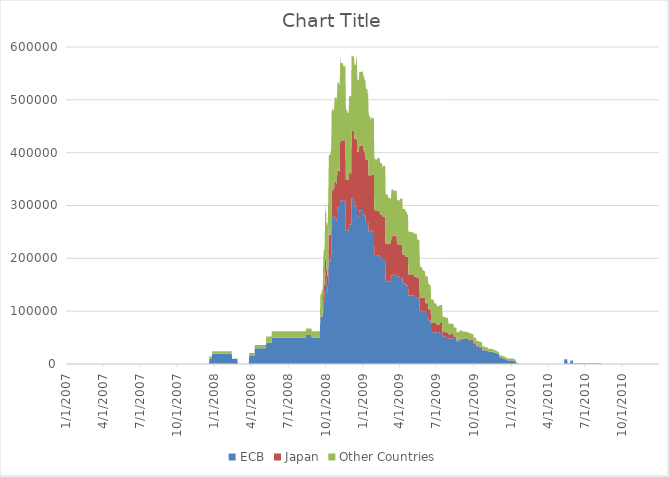
| Category | ECB | Japan | Other Countries |
|---|---|---|---|
| 1/1/07 | 0 | 0 | 0 |
| 1/2/07 | 0 | 0 | 0 |
| 1/3/07 | 0 | 0 | 0 |
| 1/4/07 | 0 | 0 | 0 |
| 1/5/07 | 0 | 0 | 0 |
| 1/6/07 | 0 | 0 | 0 |
| 1/7/07 | 0 | 0 | 0 |
| 1/8/07 | 0 | 0 | 0 |
| 1/9/07 | 0 | 0 | 0 |
| 1/10/07 | 0 | 0 | 0 |
| 1/11/07 | 0 | 0 | 0 |
| 1/12/07 | 0 | 0 | 0 |
| 1/13/07 | 0 | 0 | 0 |
| 1/14/07 | 0 | 0 | 0 |
| 1/15/07 | 0 | 0 | 0 |
| 1/16/07 | 0 | 0 | 0 |
| 1/17/07 | 0 | 0 | 0 |
| 1/18/07 | 0 | 0 | 0 |
| 1/19/07 | 0 | 0 | 0 |
| 1/20/07 | 0 | 0 | 0 |
| 1/21/07 | 0 | 0 | 0 |
| 1/22/07 | 0 | 0 | 0 |
| 1/23/07 | 0 | 0 | 0 |
| 1/24/07 | 0 | 0 | 0 |
| 1/25/07 | 0 | 0 | 0 |
| 1/26/07 | 0 | 0 | 0 |
| 1/27/07 | 0 | 0 | 0 |
| 1/28/07 | 0 | 0 | 0 |
| 1/29/07 | 0 | 0 | 0 |
| 1/30/07 | 0 | 0 | 0 |
| 1/31/07 | 0 | 0 | 0 |
| 2/1/07 | 0 | 0 | 0 |
| 2/2/07 | 0 | 0 | 0 |
| 2/3/07 | 0 | 0 | 0 |
| 2/4/07 | 0 | 0 | 0 |
| 2/5/07 | 0 | 0 | 0 |
| 2/6/07 | 0 | 0 | 0 |
| 2/7/07 | 0 | 0 | 0 |
| 2/8/07 | 0 | 0 | 0 |
| 2/9/07 | 0 | 0 | 0 |
| 2/10/07 | 0 | 0 | 0 |
| 2/11/07 | 0 | 0 | 0 |
| 2/12/07 | 0 | 0 | 0 |
| 2/13/07 | 0 | 0 | 0 |
| 2/14/07 | 0 | 0 | 0 |
| 2/15/07 | 0 | 0 | 0 |
| 2/16/07 | 0 | 0 | 0 |
| 2/17/07 | 0 | 0 | 0 |
| 2/18/07 | 0 | 0 | 0 |
| 2/19/07 | 0 | 0 | 0 |
| 2/20/07 | 0 | 0 | 0 |
| 2/21/07 | 0 | 0 | 0 |
| 2/22/07 | 0 | 0 | 0 |
| 2/23/07 | 0 | 0 | 0 |
| 2/24/07 | 0 | 0 | 0 |
| 2/25/07 | 0 | 0 | 0 |
| 2/26/07 | 0 | 0 | 0 |
| 2/27/07 | 0 | 0 | 0 |
| 2/28/07 | 0 | 0 | 0 |
| 3/1/07 | 0 | 0 | 0 |
| 3/2/07 | 0 | 0 | 0 |
| 3/3/07 | 0 | 0 | 0 |
| 3/4/07 | 0 | 0 | 0 |
| 3/5/07 | 0 | 0 | 0 |
| 3/6/07 | 0 | 0 | 0 |
| 3/7/07 | 0 | 0 | 0 |
| 3/8/07 | 0 | 0 | 0 |
| 3/9/07 | 0 | 0 | 0 |
| 3/10/07 | 0 | 0 | 0 |
| 3/11/07 | 0 | 0 | 0 |
| 3/12/07 | 0 | 0 | 0 |
| 3/13/07 | 0 | 0 | 0 |
| 3/14/07 | 0 | 0 | 0 |
| 3/15/07 | 0 | 0 | 0 |
| 3/16/07 | 0 | 0 | 0 |
| 3/17/07 | 0 | 0 | 0 |
| 3/18/07 | 0 | 0 | 0 |
| 3/19/07 | 0 | 0 | 0 |
| 3/20/07 | 0 | 0 | 0 |
| 3/21/07 | 0 | 0 | 0 |
| 3/22/07 | 0 | 0 | 0 |
| 3/23/07 | 0 | 0 | 0 |
| 3/24/07 | 0 | 0 | 0 |
| 3/25/07 | 0 | 0 | 0 |
| 3/26/07 | 0 | 0 | 0 |
| 3/27/07 | 0 | 0 | 0 |
| 3/28/07 | 0 | 0 | 0 |
| 3/29/07 | 0 | 0 | 0 |
| 3/30/07 | 0 | 0 | 0 |
| 3/31/07 | 0 | 0 | 0 |
| 4/1/07 | 0 | 0 | 0 |
| 4/2/07 | 0 | 0 | 0 |
| 4/3/07 | 0 | 0 | 0 |
| 4/4/07 | 0 | 0 | 0 |
| 4/5/07 | 0 | 0 | 0 |
| 4/6/07 | 0 | 0 | 0 |
| 4/7/07 | 0 | 0 | 0 |
| 4/8/07 | 0 | 0 | 0 |
| 4/9/07 | 0 | 0 | 0 |
| 4/10/07 | 0 | 0 | 0 |
| 4/11/07 | 0 | 0 | 0 |
| 4/12/07 | 0 | 0 | 0 |
| 4/13/07 | 0 | 0 | 0 |
| 4/14/07 | 0 | 0 | 0 |
| 4/15/07 | 0 | 0 | 0 |
| 4/16/07 | 0 | 0 | 0 |
| 4/17/07 | 0 | 0 | 0 |
| 4/18/07 | 0 | 0 | 0 |
| 4/19/07 | 0 | 0 | 0 |
| 4/20/07 | 0 | 0 | 0 |
| 4/21/07 | 0 | 0 | 0 |
| 4/22/07 | 0 | 0 | 0 |
| 4/23/07 | 0 | 0 | 0 |
| 4/24/07 | 0 | 0 | 0 |
| 4/25/07 | 0 | 0 | 0 |
| 4/26/07 | 0 | 0 | 0 |
| 4/27/07 | 0 | 0 | 0 |
| 4/28/07 | 0 | 0 | 0 |
| 4/29/07 | 0 | 0 | 0 |
| 4/30/07 | 0 | 0 | 0 |
| 5/1/07 | 0 | 0 | 0 |
| 5/2/07 | 0 | 0 | 0 |
| 5/3/07 | 0 | 0 | 0 |
| 5/4/07 | 0 | 0 | 0 |
| 5/5/07 | 0 | 0 | 0 |
| 5/6/07 | 0 | 0 | 0 |
| 5/7/07 | 0 | 0 | 0 |
| 5/8/07 | 0 | 0 | 0 |
| 5/9/07 | 0 | 0 | 0 |
| 5/10/07 | 0 | 0 | 0 |
| 5/11/07 | 0 | 0 | 0 |
| 5/12/07 | 0 | 0 | 0 |
| 5/13/07 | 0 | 0 | 0 |
| 5/14/07 | 0 | 0 | 0 |
| 5/15/07 | 0 | 0 | 0 |
| 5/16/07 | 0 | 0 | 0 |
| 5/17/07 | 0 | 0 | 0 |
| 5/18/07 | 0 | 0 | 0 |
| 5/19/07 | 0 | 0 | 0 |
| 5/20/07 | 0 | 0 | 0 |
| 5/21/07 | 0 | 0 | 0 |
| 5/22/07 | 0 | 0 | 0 |
| 5/23/07 | 0 | 0 | 0 |
| 5/24/07 | 0 | 0 | 0 |
| 5/25/07 | 0 | 0 | 0 |
| 5/26/07 | 0 | 0 | 0 |
| 5/27/07 | 0 | 0 | 0 |
| 5/28/07 | 0 | 0 | 0 |
| 5/29/07 | 0 | 0 | 0 |
| 5/30/07 | 0 | 0 | 0 |
| 5/31/07 | 0 | 0 | 0 |
| 6/1/07 | 0 | 0 | 0 |
| 6/2/07 | 0 | 0 | 0 |
| 6/3/07 | 0 | 0 | 0 |
| 6/4/07 | 0 | 0 | 0 |
| 6/5/07 | 0 | 0 | 0 |
| 6/6/07 | 0 | 0 | 0 |
| 6/7/07 | 0 | 0 | 0 |
| 6/8/07 | 0 | 0 | 0 |
| 6/9/07 | 0 | 0 | 0 |
| 6/10/07 | 0 | 0 | 0 |
| 6/11/07 | 0 | 0 | 0 |
| 6/12/07 | 0 | 0 | 0 |
| 6/13/07 | 0 | 0 | 0 |
| 6/14/07 | 0 | 0 | 0 |
| 6/15/07 | 0 | 0 | 0 |
| 6/16/07 | 0 | 0 | 0 |
| 6/17/07 | 0 | 0 | 0 |
| 6/18/07 | 0 | 0 | 0 |
| 6/19/07 | 0 | 0 | 0 |
| 6/20/07 | 0 | 0 | 0 |
| 6/21/07 | 0 | 0 | 0 |
| 6/22/07 | 0 | 0 | 0 |
| 6/23/07 | 0 | 0 | 0 |
| 6/24/07 | 0 | 0 | 0 |
| 6/25/07 | 0 | 0 | 0 |
| 6/26/07 | 0 | 0 | 0 |
| 6/27/07 | 0 | 0 | 0 |
| 6/28/07 | 0 | 0 | 0 |
| 6/29/07 | 0 | 0 | 0 |
| 6/30/07 | 0 | 0 | 0 |
| 7/1/07 | 0 | 0 | 0 |
| 7/2/07 | 0 | 0 | 0 |
| 7/3/07 | 0 | 0 | 0 |
| 7/4/07 | 0 | 0 | 0 |
| 7/5/07 | 0 | 0 | 0 |
| 7/6/07 | 0 | 0 | 0 |
| 7/7/07 | 0 | 0 | 0 |
| 7/8/07 | 0 | 0 | 0 |
| 7/9/07 | 0 | 0 | 0 |
| 7/10/07 | 0 | 0 | 0 |
| 7/11/07 | 0 | 0 | 0 |
| 7/12/07 | 0 | 0 | 0 |
| 7/13/07 | 0 | 0 | 0 |
| 7/14/07 | 0 | 0 | 0 |
| 7/15/07 | 0 | 0 | 0 |
| 7/16/07 | 0 | 0 | 0 |
| 7/17/07 | 0 | 0 | 0 |
| 7/18/07 | 0 | 0 | 0 |
| 7/19/07 | 0 | 0 | 0 |
| 7/20/07 | 0 | 0 | 0 |
| 7/21/07 | 0 | 0 | 0 |
| 7/22/07 | 0 | 0 | 0 |
| 7/23/07 | 0 | 0 | 0 |
| 7/24/07 | 0 | 0 | 0 |
| 7/25/07 | 0 | 0 | 0 |
| 7/26/07 | 0 | 0 | 0 |
| 7/27/07 | 0 | 0 | 0 |
| 7/28/07 | 0 | 0 | 0 |
| 7/29/07 | 0 | 0 | 0 |
| 7/30/07 | 0 | 0 | 0 |
| 7/31/07 | 0 | 0 | 0 |
| 8/1/07 | 0 | 0 | 0 |
| 8/2/07 | 0 | 0 | 0 |
| 8/3/07 | 0 | 0 | 0 |
| 8/4/07 | 0 | 0 | 0 |
| 8/5/07 | 0 | 0 | 0 |
| 8/6/07 | 0 | 0 | 0 |
| 8/7/07 | 0 | 0 | 0 |
| 8/8/07 | 0 | 0 | 0 |
| 8/9/07 | 0 | 0 | 0 |
| 8/10/07 | 0 | 0 | 0 |
| 8/11/07 | 0 | 0 | 0 |
| 8/12/07 | 0 | 0 | 0 |
| 8/13/07 | 0 | 0 | 0 |
| 8/14/07 | 0 | 0 | 0 |
| 8/15/07 | 0 | 0 | 0 |
| 8/16/07 | 0 | 0 | 0 |
| 8/17/07 | 0 | 0 | 0 |
| 8/18/07 | 0 | 0 | 0 |
| 8/19/07 | 0 | 0 | 0 |
| 8/20/07 | 0 | 0 | 0 |
| 8/21/07 | 0 | 0 | 0 |
| 8/22/07 | 0 | 0 | 0 |
| 8/23/07 | 0 | 0 | 0 |
| 8/24/07 | 0 | 0 | 0 |
| 8/25/07 | 0 | 0 | 0 |
| 8/26/07 | 0 | 0 | 0 |
| 8/27/07 | 0 | 0 | 0 |
| 8/28/07 | 0 | 0 | 0 |
| 8/29/07 | 0 | 0 | 0 |
| 8/30/07 | 0 | 0 | 0 |
| 8/31/07 | 0 | 0 | 0 |
| 9/1/07 | 0 | 0 | 0 |
| 9/2/07 | 0 | 0 | 0 |
| 9/3/07 | 0 | 0 | 0 |
| 9/4/07 | 0 | 0 | 0 |
| 9/5/07 | 0 | 0 | 0 |
| 9/6/07 | 0 | 0 | 0 |
| 9/7/07 | 0 | 0 | 0 |
| 9/8/07 | 0 | 0 | 0 |
| 9/9/07 | 0 | 0 | 0 |
| 9/10/07 | 0 | 0 | 0 |
| 9/11/07 | 0 | 0 | 0 |
| 9/12/07 | 0 | 0 | 0 |
| 9/13/07 | 0 | 0 | 0 |
| 9/14/07 | 0 | 0 | 0 |
| 9/15/07 | 0 | 0 | 0 |
| 9/16/07 | 0 | 0 | 0 |
| 9/17/07 | 0 | 0 | 0 |
| 9/18/07 | 0 | 0 | 0 |
| 9/19/07 | 0 | 0 | 0 |
| 9/20/07 | 0 | 0 | 0 |
| 9/21/07 | 0 | 0 | 0 |
| 9/22/07 | 0 | 0 | 0 |
| 9/23/07 | 0 | 0 | 0 |
| 9/24/07 | 0 | 0 | 0 |
| 9/25/07 | 0 | 0 | 0 |
| 9/26/07 | 0 | 0 | 0 |
| 9/27/07 | 0 | 0 | 0 |
| 9/28/07 | 0 | 0 | 0 |
| 9/29/07 | 0 | 0 | 0 |
| 9/30/07 | 0 | 0 | 0 |
| 10/1/07 | 0 | 0 | 0 |
| 10/2/07 | 0 | 0 | 0 |
| 10/3/07 | 0 | 0 | 0 |
| 10/4/07 | 0 | 0 | 0 |
| 10/5/07 | 0 | 0 | 0 |
| 10/6/07 | 0 | 0 | 0 |
| 10/7/07 | 0 | 0 | 0 |
| 10/8/07 | 0 | 0 | 0 |
| 10/9/07 | 0 | 0 | 0 |
| 10/10/07 | 0 | 0 | 0 |
| 10/11/07 | 0 | 0 | 0 |
| 10/12/07 | 0 | 0 | 0 |
| 10/13/07 | 0 | 0 | 0 |
| 10/14/07 | 0 | 0 | 0 |
| 10/15/07 | 0 | 0 | 0 |
| 10/16/07 | 0 | 0 | 0 |
| 10/17/07 | 0 | 0 | 0 |
| 10/18/07 | 0 | 0 | 0 |
| 10/19/07 | 0 | 0 | 0 |
| 10/20/07 | 0 | 0 | 0 |
| 10/21/07 | 0 | 0 | 0 |
| 10/22/07 | 0 | 0 | 0 |
| 10/23/07 | 0 | 0 | 0 |
| 10/24/07 | 0 | 0 | 0 |
| 10/25/07 | 0 | 0 | 0 |
| 10/26/07 | 0 | 0 | 0 |
| 10/27/07 | 0 | 0 | 0 |
| 10/28/07 | 0 | 0 | 0 |
| 10/29/07 | 0 | 0 | 0 |
| 10/30/07 | 0 | 0 | 0 |
| 10/31/07 | 0 | 0 | 0 |
| 11/1/07 | 0 | 0 | 0 |
| 11/2/07 | 0 | 0 | 0 |
| 11/3/07 | 0 | 0 | 0 |
| 11/4/07 | 0 | 0 | 0 |
| 11/5/07 | 0 | 0 | 0 |
| 11/6/07 | 0 | 0 | 0 |
| 11/7/07 | 0 | 0 | 0 |
| 11/8/07 | 0 | 0 | 0 |
| 11/9/07 | 0 | 0 | 0 |
| 11/10/07 | 0 | 0 | 0 |
| 11/11/07 | 0 | 0 | 0 |
| 11/12/07 | 0 | 0 | 0 |
| 11/13/07 | 0 | 0 | 0 |
| 11/14/07 | 0 | 0 | 0 |
| 11/15/07 | 0 | 0 | 0 |
| 11/16/07 | 0 | 0 | 0 |
| 11/17/07 | 0 | 0 | 0 |
| 11/18/07 | 0 | 0 | 0 |
| 11/19/07 | 0 | 0 | 0 |
| 11/20/07 | 0 | 0 | 0 |
| 11/21/07 | 0 | 0 | 0 |
| 11/22/07 | 0 | 0 | 0 |
| 11/23/07 | 0 | 0 | 0 |
| 11/24/07 | 0 | 0 | 0 |
| 11/25/07 | 0 | 0 | 0 |
| 11/26/07 | 0 | 0 | 0 |
| 11/27/07 | 0 | 0 | 0 |
| 11/28/07 | 0 | 0 | 0 |
| 11/29/07 | 0 | 0 | 0 |
| 11/30/07 | 0 | 0 | 0 |
| 12/1/07 | 0 | 0 | 0 |
| 12/2/07 | 0 | 0 | 0 |
| 12/3/07 | 0 | 0 | 0 |
| 12/4/07 | 0 | 0 | 0 |
| 12/5/07 | 0 | 0 | 0 |
| 12/6/07 | 0 | 0 | 0 |
| 12/7/07 | 0 | 0 | 0 |
| 12/8/07 | 0 | 0 | 0 |
| 12/9/07 | 0 | 0 | 0 |
| 12/10/07 | 0 | 0 | 0 |
| 12/11/07 | 0 | 0 | 0 |
| 12/12/07 | 0 | 0 | 0 |
| 12/13/07 | 0 | 0 | 0 |
| 12/14/07 | 0 | 0 | 0 |
| 12/15/07 | 0 | 0 | 0 |
| 12/16/07 | 0 | 0 | 0 |
| 12/17/07 | 0 | 0 | 0 |
| 12/18/07 | 0 | 0 | 0 |
| 12/19/07 | 0 | 0 | 0 |
| 12/20/07 | 10000 | 0 | 4000 |
| 12/21/07 | 10000 | 0 | 4000 |
| 12/22/07 | 10000 | 0 | 4000 |
| 12/23/07 | 10000 | 0 | 4000 |
| 12/24/07 | 10000 | 0 | 4000 |
| 12/25/07 | 10000 | 0 | 4000 |
| 12/26/07 | 10000 | 0 | 4000 |
| 12/27/07 | 20000 | 0 | 4000 |
| 12/28/07 | 20000 | 0 | 4000 |
| 12/29/07 | 20000 | 0 | 4000 |
| 12/30/07 | 20000 | 0 | 4000 |
| 12/31/07 | 20000 | 0 | 4000 |
| 1/1/08 | 20000 | 0 | 4000 |
| 1/2/08 | 20000 | 0 | 4000 |
| 1/3/08 | 20000 | 0 | 4000 |
| 1/4/08 | 20000 | 0 | 4000 |
| 1/5/08 | 20000 | 0 | 4000 |
| 1/6/08 | 20000 | 0 | 4000 |
| 1/7/08 | 20000 | 0 | 4000 |
| 1/8/08 | 20000 | 0 | 4000 |
| 1/9/08 | 20000 | 0 | 4000 |
| 1/10/08 | 20000 | 0 | 4000 |
| 1/11/08 | 20000 | 0 | 4000 |
| 1/12/08 | 20000 | 0 | 4000 |
| 1/13/08 | 20000 | 0 | 4000 |
| 1/14/08 | 20000 | 0 | 4000 |
| 1/15/08 | 20000 | 0 | 4000 |
| 1/16/08 | 20000 | 0 | 4000 |
| 1/17/08 | 20000 | 0 | 4000 |
| 1/18/08 | 20000 | 0 | 4000 |
| 1/19/08 | 20000 | 0 | 4000 |
| 1/20/08 | 20000 | 0 | 4000 |
| 1/21/08 | 20000 | 0 | 4000 |
| 1/22/08 | 20000 | 0 | 4000 |
| 1/23/08 | 20000 | 0 | 4000 |
| 1/24/08 | 20000 | 0 | 4000 |
| 1/25/08 | 20000 | 0 | 4000 |
| 1/26/08 | 20000 | 0 | 4000 |
| 1/27/08 | 20000 | 0 | 4000 |
| 1/28/08 | 20000 | 0 | 4000 |
| 1/29/08 | 20000 | 0 | 4000 |
| 1/30/08 | 20000 | 0 | 4000 |
| 1/31/08 | 20000 | 0 | 4000 |
| 2/1/08 | 20000 | 0 | 4000 |
| 2/2/08 | 20000 | 0 | 4000 |
| 2/3/08 | 20000 | 0 | 4000 |
| 2/4/08 | 20000 | 0 | 4000 |
| 2/5/08 | 20000 | 0 | 4000 |
| 2/6/08 | 20000 | 0 | 4000 |
| 2/7/08 | 20000 | 0 | 4000 |
| 2/8/08 | 20000 | 0 | 4000 |
| 2/9/08 | 20000 | 0 | 4000 |
| 2/10/08 | 20000 | 0 | 4000 |
| 2/11/08 | 20000 | 0 | 4000 |
| 2/12/08 | 20000 | 0 | 4000 |
| 2/13/08 | 20000 | 0 | 4000 |
| 2/14/08 | 10000 | 0 | 0 |
| 2/15/08 | 10000 | 0 | 0 |
| 2/16/08 | 10000 | 0 | 0 |
| 2/17/08 | 10000 | 0 | 0 |
| 2/18/08 | 10000 | 0 | 0 |
| 2/19/08 | 10000 | 0 | 0 |
| 2/20/08 | 10000 | 0 | 0 |
| 2/21/08 | 10000 | 0 | 0 |
| 2/22/08 | 10000 | 0 | 0 |
| 2/23/08 | 10000 | 0 | 0 |
| 2/24/08 | 10000 | 0 | 0 |
| 2/25/08 | 10000 | 0 | 0 |
| 2/26/08 | 10000 | 0 | 0 |
| 2/27/08 | 10000 | 0 | 0 |
| 2/28/08 | 0 | 0 | 0 |
| 2/29/08 | 0 | 0 | 0 |
| 3/1/08 | 0 | 0 | 0 |
| 3/2/08 | 0 | 0 | 0 |
| 3/3/08 | 0 | 0 | 0 |
| 3/4/08 | 0 | 0 | 0 |
| 3/5/08 | 0 | 0 | 0 |
| 3/6/08 | 0 | 0 | 0 |
| 3/7/08 | 0 | 0 | 0 |
| 3/8/08 | 0 | 0 | 0 |
| 3/9/08 | 0 | 0 | 0 |
| 3/10/08 | 0 | 0 | 0 |
| 3/11/08 | 0 | 0 | 0 |
| 3/12/08 | 0 | 0 | 0 |
| 3/13/08 | 0 | 0 | 0 |
| 3/14/08 | 0 | 0 | 0 |
| 3/15/08 | 0 | 0 | 0 |
| 3/16/08 | 0 | 0 | 0 |
| 3/17/08 | 0 | 0 | 0 |
| 3/18/08 | 0 | 0 | 0 |
| 3/19/08 | 0 | 0 | 0 |
| 3/20/08 | 0 | 0 | 0 |
| 3/21/08 | 0 | 0 | 0 |
| 3/22/08 | 0 | 0 | 0 |
| 3/23/08 | 0 | 0 | 0 |
| 3/24/08 | 0 | 0 | 0 |
| 3/25/08 | 0 | 0 | 0 |
| 3/26/08 | 0 | 0 | 0 |
| 3/27/08 | 15000 | 0 | 6000 |
| 3/28/08 | 15000 | 0 | 6000 |
| 3/29/08 | 15000 | 0 | 6000 |
| 3/30/08 | 15000 | 0 | 6000 |
| 3/31/08 | 15000 | 0 | 6000 |
| 4/1/08 | 15000 | 0 | 6000 |
| 4/2/08 | 15000 | 0 | 6000 |
| 4/3/08 | 15000 | 0 | 6000 |
| 4/4/08 | 15000 | 0 | 6000 |
| 4/5/08 | 15000 | 0 | 6000 |
| 4/6/08 | 15000 | 0 | 6000 |
| 4/7/08 | 15000 | 0 | 6000 |
| 4/8/08 | 15000 | 0 | 6000 |
| 4/9/08 | 15000 | 0 | 6000 |
| 4/10/08 | 30000 | 0 | 6000 |
| 4/11/08 | 30000 | 0 | 6000 |
| 4/12/08 | 30000 | 0 | 6000 |
| 4/13/08 | 30000 | 0 | 6000 |
| 4/14/08 | 30000 | 0 | 6000 |
| 4/15/08 | 30000 | 0 | 6000 |
| 4/16/08 | 30000 | 0 | 6000 |
| 4/17/08 | 30000 | 0 | 6000 |
| 4/18/08 | 30000 | 0 | 6000 |
| 4/19/08 | 30000 | 0 | 6000 |
| 4/20/08 | 30000 | 0 | 6000 |
| 4/21/08 | 30000 | 0 | 6000 |
| 4/22/08 | 30000 | 0 | 6000 |
| 4/23/08 | 30000 | 0 | 6000 |
| 4/24/08 | 30000 | 0 | 6000 |
| 4/25/08 | 30000 | 0 | 6000 |
| 4/26/08 | 30000 | 0 | 6000 |
| 4/27/08 | 30000 | 0 | 6000 |
| 4/28/08 | 30000 | 0 | 6000 |
| 4/29/08 | 30000 | 0 | 6000 |
| 4/30/08 | 30000 | 0 | 6000 |
| 5/1/08 | 30000 | 0 | 6000 |
| 5/2/08 | 30000 | 0 | 6000 |
| 5/3/08 | 30000 | 0 | 6000 |
| 5/4/08 | 30000 | 0 | 6000 |
| 5/5/08 | 30000 | 0 | 6000 |
| 5/6/08 | 30000 | 0 | 6000 |
| 5/7/08 | 30000 | 0 | 6000 |
| 5/8/08 | 40000 | 0 | 12000 |
| 5/9/08 | 40000 | 0 | 12000 |
| 5/10/08 | 40000 | 0 | 12000 |
| 5/11/08 | 40000 | 0 | 12000 |
| 5/12/08 | 40000 | 0 | 12000 |
| 5/13/08 | 40000 | 0 | 12000 |
| 5/14/08 | 40000 | 0 | 12000 |
| 5/15/08 | 40000 | 0 | 12000 |
| 5/16/08 | 40000 | 0 | 12000 |
| 5/17/08 | 40000 | 0 | 12000 |
| 5/18/08 | 40000 | 0 | 12000 |
| 5/19/08 | 40000 | 0 | 12000 |
| 5/20/08 | 40000 | 0 | 12000 |
| 5/21/08 | 40000 | 0 | 12000 |
| 5/22/08 | 50000 | 0 | 12000 |
| 5/23/08 | 50000 | 0 | 12000 |
| 5/24/08 | 50000 | 0 | 12000 |
| 5/25/08 | 50000 | 0 | 12000 |
| 5/26/08 | 50000 | 0 | 12000 |
| 5/27/08 | 50000 | 0 | 12000 |
| 5/28/08 | 50000 | 0 | 12000 |
| 5/29/08 | 50000 | 0 | 12000 |
| 5/30/08 | 50000 | 0 | 12000 |
| 5/31/08 | 50000 | 0 | 12000 |
| 6/1/08 | 50000 | 0 | 12000 |
| 6/2/08 | 50000 | 0 | 12000 |
| 6/3/08 | 50000 | 0 | 12000 |
| 6/4/08 | 50000 | 0 | 12000 |
| 6/5/08 | 50000 | 0 | 12000 |
| 6/6/08 | 50000 | 0 | 12000 |
| 6/7/08 | 50000 | 0 | 12000 |
| 6/8/08 | 50000 | 0 | 12000 |
| 6/9/08 | 50000 | 0 | 12000 |
| 6/10/08 | 50000 | 0 | 12000 |
| 6/11/08 | 50000 | 0 | 12000 |
| 6/12/08 | 50000 | 0 | 12000 |
| 6/13/08 | 50000 | 0 | 12000 |
| 6/14/08 | 50000 | 0 | 12000 |
| 6/15/08 | 50000 | 0 | 12000 |
| 6/16/08 | 50000 | 0 | 12000 |
| 6/17/08 | 50000 | 0 | 12000 |
| 6/18/08 | 50000 | 0 | 12000 |
| 6/19/08 | 50000 | 0 | 12000 |
| 6/20/08 | 50000 | 0 | 12000 |
| 6/21/08 | 50000 | 0 | 12000 |
| 6/22/08 | 50000 | 0 | 12000 |
| 6/23/08 | 50000 | 0 | 12000 |
| 6/24/08 | 50000 | 0 | 12000 |
| 6/25/08 | 50000 | 0 | 12000 |
| 6/26/08 | 50000 | 0 | 12000 |
| 6/27/08 | 50000 | 0 | 12000 |
| 6/28/08 | 50000 | 0 | 12000 |
| 6/29/08 | 50000 | 0 | 12000 |
| 6/30/08 | 50000 | 0 | 12000 |
| 7/1/08 | 50000 | 0 | 12000 |
| 7/2/08 | 50000 | 0 | 12000 |
| 7/3/08 | 50000 | 0 | 12000 |
| 7/4/08 | 50000 | 0 | 12000 |
| 7/5/08 | 50000 | 0 | 12000 |
| 7/6/08 | 50000 | 0 | 12000 |
| 7/7/08 | 50000 | 0 | 12000 |
| 7/8/08 | 50000 | 0 | 12000 |
| 7/9/08 | 50000 | 0 | 12000 |
| 7/10/08 | 50000 | 0 | 12000 |
| 7/11/08 | 50000 | 0 | 12000 |
| 7/12/08 | 50000 | 0 | 12000 |
| 7/13/08 | 50000 | 0 | 12000 |
| 7/14/08 | 50000 | 0 | 12000 |
| 7/15/08 | 50000 | 0 | 12000 |
| 7/16/08 | 50000 | 0 | 12000 |
| 7/17/08 | 50000 | 0 | 12000 |
| 7/18/08 | 50000 | 0 | 12000 |
| 7/19/08 | 50000 | 0 | 12000 |
| 7/20/08 | 50000 | 0 | 12000 |
| 7/21/08 | 50000 | 0 | 12000 |
| 7/22/08 | 50000 | 0 | 12000 |
| 7/23/08 | 50000 | 0 | 12000 |
| 7/24/08 | 50000 | 0 | 12000 |
| 7/25/08 | 50000 | 0 | 12000 |
| 7/26/08 | 50000 | 0 | 12000 |
| 7/27/08 | 50000 | 0 | 12000 |
| 7/28/08 | 50000 | 0 | 12000 |
| 7/29/08 | 50000 | 0 | 12000 |
| 7/30/08 | 50000 | 0 | 12000 |
| 7/31/08 | 50000 | 0 | 12000 |
| 8/1/08 | 50000 | 0 | 12000 |
| 8/2/08 | 50000 | 0 | 12000 |
| 8/3/08 | 50000 | 0 | 12000 |
| 8/4/08 | 50000 | 0 | 12000 |
| 8/5/08 | 50000 | 0 | 12000 |
| 8/6/08 | 50000 | 0 | 12000 |
| 8/7/08 | 50000 | 0 | 12000 |
| 8/8/08 | 50000 | 0 | 12000 |
| 8/9/08 | 50000 | 0 | 12000 |
| 8/10/08 | 50000 | 0 | 12000 |
| 8/11/08 | 50000 | 0 | 12000 |
| 8/12/08 | 50000 | 0 | 12000 |
| 8/13/08 | 50000 | 0 | 12000 |
| 8/14/08 | 55000 | 0 | 12000 |
| 8/15/08 | 55000 | 0 | 12000 |
| 8/16/08 | 55000 | 0 | 12000 |
| 8/17/08 | 55000 | 0 | 12000 |
| 8/18/08 | 55000 | 0 | 12000 |
| 8/19/08 | 55000 | 0 | 12000 |
| 8/20/08 | 55000 | 0 | 12000 |
| 8/21/08 | 55000 | 0 | 12000 |
| 8/22/08 | 55000 | 0 | 12000 |
| 8/23/08 | 55000 | 0 | 12000 |
| 8/24/08 | 55000 | 0 | 12000 |
| 8/25/08 | 55000 | 0 | 12000 |
| 8/26/08 | 55000 | 0 | 12000 |
| 8/27/08 | 55000 | 0 | 12000 |
| 8/28/08 | 50000 | 0 | 12000 |
| 8/29/08 | 50000 | 0 | 12000 |
| 8/30/08 | 50000 | 0 | 12000 |
| 8/31/08 | 50000 | 0 | 12000 |
| 9/1/08 | 50000 | 0 | 12000 |
| 9/2/08 | 50000 | 0 | 12000 |
| 9/3/08 | 50000 | 0 | 12000 |
| 9/4/08 | 50000 | 0 | 12000 |
| 9/5/08 | 50000 | 0 | 12000 |
| 9/6/08 | 50000 | 0 | 12000 |
| 9/7/08 | 50000 | 0 | 12000 |
| 9/8/08 | 50000 | 0 | 12000 |
| 9/9/08 | 50000 | 0 | 12000 |
| 9/10/08 | 50000 | 0 | 12000 |
| 9/11/08 | 50000 | 0 | 12000 |
| 9/12/08 | 50000 | 0 | 12000 |
| 9/13/08 | 50000 | 0 | 12000 |
| 9/14/08 | 50000 | 0 | 12000 |
| 9/15/08 | 50000 | 0 | 12000 |
| 9/16/08 | 50000 | 0 | 12000 |
| 9/17/08 | 50000 | 0 | 12000 |
| 9/18/08 | 90000 | 0 | 36050 |
| 9/19/08 | 90000 | 0 | 42800 |
| 9/20/08 | 90000 | 0 | 42800 |
| 9/21/08 | 90000 | 0 | 42800 |
| 9/22/08 | 90000 | 0 | 48150 |
| 9/23/08 | 90000 | 0 | 52101 |
| 9/24/08 | 90000 | 0 | 51900 |
| 9/25/08 | 95000 | 29622 | 59045 |
| 9/26/08 | 120000 | 29622 | 65900 |
| 9/27/08 | 120000 | 29622 | 65900 |
| 9/28/08 | 120000 | 29622 | 65900 |
| 9/29/08 | 120000 | 29622 | 77138 |
| 9/30/08 | 174742 | 29622 | 83899 |
| 10/1/08 | 162000 | 29622 | 94810 |
| 10/2/08 | 179700 | 29622 | 98316 |
| 10/3/08 | 147770.9 | 29622 | 89798 |
| 10/4/08 | 147770.9 | 29622 | 89798 |
| 10/5/08 | 147770.9 | 29622 | 89798 |
| 10/6/08 | 136900 | 29622 | 92798 |
| 10/7/08 | 135550 | 29622 | 117862 |
| 10/8/08 | 185000 | 29622 | 120562 |
| 10/9/08 | 213000 | 49622 | 128919 |
| 10/10/08 | 194378 | 49622 | 152478 |
| 10/11/08 | 194378 | 49622 | 152478 |
| 10/12/08 | 194378 | 49622 | 152478 |
| 10/13/08 | 194378 | 49622 | 152478 |
| 10/14/08 | 202703.5 | 49622 | 150210 |
| 10/15/08 | 204300 | 49622 | 152960 |
| 10/16/08 | 273625 | 49622 | 154218 |
| 10/17/08 | 279125 | 49622 | 152783 |
| 10/18/08 | 279125 | 49622 | 152783 |
| 10/19/08 | 279125 | 49622 | 152783 |
| 10/20/08 | 283125 | 49622 | 152235 |
| 10/21/08 | 279625 | 49622 | 149726 |
| 10/22/08 | 280425 | 49622 | 147112 |
| 10/23/08 | 278558.4 | 70168 | 151685 |
| 10/24/08 | 275358.4 | 70168 | 158886 |
| 10/25/08 | 275358.4 | 70168 | 158886 |
| 10/26/08 | 275358.4 | 70168 | 158886 |
| 10/27/08 | 275958.4 | 70168 | 158037 |
| 10/28/08 | 272958.4 | 70168 | 163068 |
| 10/29/08 | 270558.4 | 70168 | 158134 |
| 10/30/08 | 301380.9 | 70168 | 158397 |
| 10/31/08 | 295380.9 | 70168 | 168015 |
| 11/1/08 | 295380.9 | 70168 | 168015 |
| 11/2/08 | 295380.9 | 70168 | 168015 |
| 11/3/08 | 295380.9 | 70168 | 163841 |
| 11/4/08 | 294680.9 | 70168 | 164152 |
| 11/5/08 | 293680.9 | 70168 | 164506 |
| 11/6/08 | 308481.2 | 114407 | 159873 |
| 11/7/08 | 309281.2 | 114407 | 146478 |
| 11/8/08 | 309281.2 | 114407 | 146478 |
| 11/9/08 | 309281.2 | 114407 | 146478 |
| 11/10/08 | 308781.2 | 114407 | 146228 |
| 11/11/08 | 308781.2 | 114407 | 146228 |
| 11/12/08 | 309081.2 | 114407 | 146228 |
| 11/13/08 | 309065.4 | 114407 | 145118 |
| 11/14/08 | 309065.4 | 114407 | 139968 |
| 11/15/08 | 309065.4 | 114407 | 139968 |
| 11/16/08 | 309065.4 | 114407 | 139968 |
| 11/17/08 | 309715.4 | 114407 | 139968 |
| 11/18/08 | 308715.4 | 114407 | 139968 |
| 11/19/08 | 307715.4 | 114407 | 139968 |
| 11/20/08 | 252138.3 | 96990 | 139182 |
| 11/21/08 | 252138.3 | 96990 | 131357 |
| 11/22/08 | 252138.3 | 96990 | 131357 |
| 11/23/08 | 252138.3 | 96990 | 131357 |
| 11/24/08 | 252138.3 | 96990 | 126307 |
| 11/25/08 | 252138.3 | 96990 | 126307 |
| 11/26/08 | 252138.3 | 96990 | 126307 |
| 11/27/08 | 252138.3 | 96990 | 126307 |
| 11/28/08 | 264112.8 | 96990 | 145716 |
| 11/29/08 | 264112.8 | 96990 | 145716 |
| 11/30/08 | 264112.8 | 96990 | 145716 |
| 12/1/08 | 264112.8 | 96990 | 145716 |
| 12/2/08 | 264112.8 | 96990 | 145716 |
| 12/3/08 | 264112.8 | 96990 | 145716 |
| 12/4/08 | 313563.8 | 127574 | 144987 |
| 12/5/08 | 313563.8 | 127574 | 141187 |
| 12/6/08 | 313563.8 | 127574 | 141187 |
| 12/7/08 | 313563.8 | 127574 | 141187 |
| 12/8/08 | 313063.8 | 127574 | 141187 |
| 12/9/08 | 313063.8 | 127574 | 141187 |
| 12/10/08 | 313813.8 | 127574 | 141187 |
| 12/11/08 | 297359.8 | 127574 | 144157 |
| 12/12/08 | 298559.8 | 127574 | 139917 |
| 12/13/08 | 298559.8 | 127574 | 139917 |
| 12/14/08 | 298559.8 | 127574 | 139917 |
| 12/15/08 | 298559.8 | 127574 | 143201 |
| 12/16/08 | 299659.8 | 127574 | 155401 |
| 12/17/08 | 300159.8 | 127574 | 155401 |
| 12/18/08 | 277376.2 | 122716 | 149485 |
| 12/19/08 | 278376.2 | 122716 | 136310 |
| 12/20/08 | 278376.2 | 122716 | 136310 |
| 12/21/08 | 278376.2 | 122716 | 136310 |
| 12/22/08 | 279026.2 | 122716 | 136310 |
| 12/23/08 | 290352.3 | 122716 | 139660 |
| 12/24/08 | 290352.3 | 122716 | 139660 |
| 12/25/08 | 290352.3 | 122716 | 139660 |
| 12/26/08 | 290352.3 | 122716 | 139660 |
| 12/27/08 | 290352.3 | 122716 | 139660 |
| 12/28/08 | 290352.3 | 122716 | 139660 |
| 12/29/08 | 291352.3 | 122716 | 139660 |
| 12/30/08 | 291352.3 | 122716 | 139660 |
| 12/31/08 | 291352.3 | 122716 | 139660 |
| 1/1/09 | 291352.3 | 122716 | 139660 |
| 1/2/09 | 281717.8 | 122716 | 140040 |
| 1/3/09 | 281717.8 | 122716 | 140040 |
| 1/4/09 | 281717.8 | 122716 | 140040 |
| 1/5/09 | 281717.8 | 118394 | 138050 |
| 1/6/09 | 281717.8 | 118394 | 138050 |
| 1/7/09 | 281717.8 | 118394 | 138050 |
| 1/8/09 | 268430 | 118394 | 138440 |
| 1/9/09 | 268430 | 118394 | 133440 |
| 1/10/09 | 268430 | 118394 | 133440 |
| 1/11/09 | 268430 | 118394 | 133440 |
| 1/12/09 | 268680 | 118394 | 133440 |
| 1/13/09 | 268680 | 118394 | 123440 |
| 1/14/09 | 268680 | 118394 | 123440 |
| 1/15/09 | 250176.6 | 106391 | 122735 |
| 1/16/09 | 250176.6 | 106391 | 112128 |
| 1/17/09 | 250176.6 | 106391 | 112128 |
| 1/18/09 | 250176.6 | 106391 | 112128 |
| 1/19/09 | 250176.6 | 106391 | 112128 |
| 1/20/09 | 250176.6 | 106391 | 106228 |
| 1/21/09 | 250176.6 | 106391 | 106228 |
| 1/22/09 | 252372.5 | 106391 | 109228 |
| 1/23/09 | 252372.5 | 106391 | 106558 |
| 1/24/09 | 252372.5 | 106391 | 106558 |
| 1/25/09 | 252372.5 | 106391 | 106558 |
| 1/26/09 | 252722.5 | 106391 | 106558 |
| 1/27/09 | 252722.5 | 106391 | 106558 |
| 1/28/09 | 252722.5 | 106391 | 106558 |
| 1/29/09 | 206372.8 | 84582 | 105893 |
| 1/30/09 | 206372.8 | 84582 | 96493 |
| 1/31/09 | 206372.8 | 84582 | 96493 |
| 2/1/09 | 206372.8 | 84582 | 96493 |
| 2/2/09 | 206372.8 | 84582 | 96493 |
| 2/3/09 | 206372.8 | 84582 | 96493 |
| 2/4/09 | 206372.8 | 84582 | 96493 |
| 2/5/09 | 204803.6 | 84582 | 96493 |
| 2/6/09 | 205003.6 | 84582 | 100493 |
| 2/7/09 | 205003.6 | 84582 | 100493 |
| 2/8/09 | 205003.6 | 84582 | 100493 |
| 2/9/09 | 205303.6 | 84582 | 100493 |
| 2/10/09 | 205303.6 | 84582 | 100493 |
| 2/11/09 | 205753.6 | 84582 | 100493 |
| 2/12/09 | 200615.9 | 82352 | 100495 |
| 2/13/09 | 200615.9 | 82352 | 97262 |
| 2/14/09 | 200615.9 | 82352 | 97262 |
| 2/15/09 | 200615.9 | 82352 | 97262 |
| 2/16/09 | 200615.9 | 82352 | 97262 |
| 2/17/09 | 200615.9 | 82352 | 95451.5 |
| 2/18/09 | 200615.9 | 82352 | 92037.3 |
| 2/19/09 | 197057.9 | 82352 | 91037.3 |
| 2/20/09 | 197057.9 | 82352 | 96037.3 |
| 2/21/09 | 197057.9 | 82352 | 96037.3 |
| 2/22/09 | 197057.9 | 82352 | 96037.3 |
| 2/23/09 | 197057.9 | 82352 | 96037.3 |
| 2/24/09 | 196557.9 | 82352 | 96037.3 |
| 2/25/09 | 196557.9 | 82352 | 96037.3 |
| 2/26/09 | 156066 | 70994 | 94381.3 |
| 2/27/09 | 156066 | 70994 | 94154.3 |
| 2/28/09 | 156066 | 70994 | 94154.3 |
| 3/1/09 | 156066 | 70994 | 94154.3 |
| 3/2/09 | 156066 | 70994 | 94154.3 |
| 3/3/09 | 156066 | 70994 | 94154.3 |
| 3/4/09 | 155466 | 70994 | 88750.9 |
| 3/5/09 | 156786 | 70994 | 87070.9 |
| 3/6/09 | 156786 | 70994 | 87070.9 |
| 3/7/09 | 156786 | 70994 | 87070.9 |
| 3/8/09 | 156786 | 70994 | 87070.9 |
| 3/9/09 | 156636 | 70994 | 85030.9 |
| 3/10/09 | 156536 | 70994 | 85030.9 |
| 3/11/09 | 156436 | 70994 | 85030.9 |
| 3/12/09 | 167526.4 | 73829 | 86306 |
| 3/13/09 | 167526.4 | 73829 | 88760.7 |
| 3/14/09 | 167526.4 | 73829 | 88760.7 |
| 3/15/09 | 167526.4 | 73829 | 88760.7 |
| 3/16/09 | 168826.4 | 73829 | 87433 |
| 3/17/09 | 169156.4 | 73829 | 87008 |
| 3/18/09 | 169656.4 | 73829 | 85526.5 |
| 3/19/09 | 168175.4 | 73829 | 85175.5 |
| 3/20/09 | 168723.4 | 73829 | 85175.5 |
| 3/21/09 | 168723.4 | 73829 | 85175.5 |
| 3/22/09 | 168723.4 | 73829 | 85175.5 |
| 3/23/09 | 168723.4 | 73829 | 85175.5 |
| 3/24/09 | 168973.4 | 73829 | 85175.5 |
| 3/25/09 | 168773.4 | 73829 | 85175.5 |
| 3/26/09 | 165716.7 | 61025 | 83675.5 |
| 3/27/09 | 165716.7 | 61025 | 83175.5 |
| 3/28/09 | 165716.7 | 61025 | 83175.5 |
| 3/29/09 | 165716.7 | 61025 | 83175.5 |
| 3/30/09 | 165716.7 | 61025 | 83175.5 |
| 3/31/09 | 165716.7 | 61025 | 83175.5 |
| 4/1/09 | 165716.7 | 61025 | 82050.3 |
| 4/2/09 | 164439.2 | 61025 | 84719.7 |
| 4/3/09 | 164439.2 | 61025 | 87794.9 |
| 4/4/09 | 164439.2 | 61025 | 87794.9 |
| 4/5/09 | 164439.2 | 61025 | 87794.9 |
| 4/6/09 | 164439.2 | 61025 | 87794.9 |
| 4/7/09 | 164439.2 | 61025 | 87794.9 |
| 4/8/09 | 164439.2 | 61025 | 87931.9 |
| 4/9/09 | 152277.4 | 54290 | 86931.9 |
| 4/10/09 | 152277.4 | 54290 | 86931.9 |
| 4/11/09 | 152277.4 | 54290 | 86931.9 |
| 4/12/09 | 152277.4 | 54290 | 86931.9 |
| 4/13/09 | 152277.4 | 54290 | 86931.9 |
| 4/14/09 | 152277.4 | 54290 | 87131.9 |
| 4/15/09 | 152277.4 | 54290 | 86965.6 |
| 4/16/09 | 148577 | 54290 | 85965.6 |
| 4/17/09 | 148577 | 54290 | 85965.6 |
| 4/18/09 | 148577 | 54290 | 85965.6 |
| 4/19/09 | 148577 | 54290 | 85965.6 |
| 4/20/09 | 148577 | 54290 | 79995.6 |
| 4/21/09 | 148577 | 54290 | 79995.6 |
| 4/22/09 | 148577 | 54290 | 79995.6 |
| 4/23/09 | 129668.1 | 39810 | 81166.6 |
| 4/24/09 | 129668.1 | 39810 | 80791.6 |
| 4/25/09 | 129668.1 | 39810 | 80791.6 |
| 4/26/09 | 129668.1 | 39810 | 80791.6 |
| 4/27/09 | 129668.1 | 39810 | 80791.6 |
| 4/28/09 | 129668.1 | 39810 | 80791.6 |
| 4/29/09 | 129668.1 | 39810 | 80034.7 |
| 4/30/09 | 130102.1 | 39810 | 79389.7 |
| 5/1/09 | 130102.1 | 39810 | 79389.7 |
| 5/2/09 | 130102.1 | 39810 | 79389.7 |
| 5/3/09 | 130102.1 | 39810 | 79389.7 |
| 5/4/09 | 130102.1 | 39810 | 79389.7 |
| 5/5/09 | 130102.1 | 39810 | 79389.7 |
| 5/6/09 | 130102.1 | 39810 | 79389.7 |
| 5/7/09 | 126777.1 | 38610 | 79389.7 |
| 5/8/09 | 126777.1 | 38610 | 81389.7 |
| 5/9/09 | 126777.1 | 38610 | 81389.7 |
| 5/10/09 | 126777.1 | 38610 | 81389.7 |
| 5/11/09 | 126777.1 | 38610 | 81389.7 |
| 5/12/09 | 126777.1 | 38610 | 81389.7 |
| 5/13/09 | 126777.1 | 38610 | 81450.9 |
| 5/14/09 | 124479.1 | 38610 | 81450.9 |
| 5/15/09 | 124479.1 | 38610 | 72023.2 |
| 5/16/09 | 124479.1 | 38610 | 72023.2 |
| 5/17/09 | 124479.1 | 38610 | 72023.2 |
| 5/18/09 | 124479.1 | 38610 | 72023.2 |
| 5/19/09 | 124479.1 | 38610 | 72023.2 |
| 5/20/09 | 124479.1 | 38610 | 72023.2 |
| 5/21/09 | 100572.5 | 25006 | 69068.2 |
| 5/22/09 | 100572.5 | 25006 | 58068.2 |
| 5/23/09 | 100572.5 | 25006 | 58068.2 |
| 5/24/09 | 100572.5 | 25006 | 58068.2 |
| 5/25/09 | 100572.5 | 25006 | 58068.2 |
| 5/26/09 | 100572.5 | 25006 | 58068.2 |
| 5/27/09 | 100572.5 | 25006 | 56068.4 |
| 5/28/09 | 99727.6 | 25006 | 52918.4 |
| 5/29/09 | 99727.6 | 25006 | 52918.4 |
| 5/30/09 | 99727.6 | 25006 | 52918.4 |
| 5/31/09 | 99727.6 | 25006 | 52918.4 |
| 6/1/09 | 99727.6 | 25006 | 51008.4 |
| 6/2/09 | 99727.6 | 25006 | 51008.4 |
| 6/3/09 | 99727.6 | 25006 | 51008.4 |
| 6/4/09 | 94559.5 | 20546 | 51008.4 |
| 6/5/09 | 94559.5 | 20546 | 51023.4 |
| 6/6/09 | 94559.5 | 20546 | 51023.4 |
| 6/7/09 | 94559.5 | 20546 | 51023.4 |
| 6/8/09 | 94559.5 | 20546 | 51023.4 |
| 6/9/09 | 94559.5 | 20546 | 51023.4 |
| 6/10/09 | 94559.5 | 20546 | 49128.5 |
| 6/11/09 | 82896.5 | 20546 | 48128.5 |
| 6/12/09 | 82896.5 | 20546 | 48128.5 |
| 6/13/09 | 82896.5 | 20546 | 48128.5 |
| 6/14/09 | 82896.5 | 20546 | 48128.5 |
| 6/15/09 | 82896.5 | 20546 | 45120.2 |
| 6/16/09 | 82896.5 | 20546 | 45120.2 |
| 6/17/09 | 82896.5 | 20546 | 45120.2 |
| 6/18/09 | 59899.4 | 17923 | 44127.2 |
| 6/19/09 | 59899.4 | 17923 | 44127.2 |
| 6/20/09 | 59899.4 | 17923 | 44127.2 |
| 6/21/09 | 59899.4 | 17923 | 44127.2 |
| 6/22/09 | 59899.4 | 17923 | 44127.2 |
| 6/23/09 | 59899.4 | 17923 | 44127.2 |
| 6/24/09 | 59899.4 | 17923 | 41607.8 |
| 6/25/09 | 59898.8 | 17923 | 41762.8 |
| 6/26/09 | 59898.8 | 17923 | 36762.8 |
| 6/27/09 | 59898.8 | 17923 | 36762.8 |
| 6/28/09 | 59898.8 | 17923 | 36762.8 |
| 6/29/09 | 59898.8 | 17923 | 36762.8 |
| 6/30/09 | 59898.8 | 17923 | 36762.8 |
| 7/1/09 | 59898.8 | 17923 | 36762.8 |
| 7/2/09 | 56878.3 | 16843 | 35762.8 |
| 7/3/09 | 56878.3 | 16843 | 35762.8 |
| 7/4/09 | 56878.3 | 16843 | 35762.8 |
| 7/5/09 | 56878.3 | 16843 | 35762.8 |
| 7/6/09 | 56878.3 | 16843 | 35772.8 |
| 7/7/09 | 56878.3 | 16843 | 35772.8 |
| 7/8/09 | 56878.3 | 16843 | 35423 |
| 7/9/09 | 60615.3 | 16843 | 34423 |
| 7/10/09 | 60615.3 | 16843 | 34423 |
| 7/11/09 | 60615.3 | 16843 | 34423 |
| 7/12/09 | 60615.3 | 16843 | 34423 |
| 7/13/09 | 60615.3 | 16843 | 34183 |
| 7/14/09 | 60615.3 | 16843 | 34183 |
| 7/15/09 | 60615.3 | 16843 | 34183 |
| 7/16/09 | 52261.2 | 9113 | 30183 |
| 7/17/09 | 52261.2 | 9113 | 28208 |
| 7/18/09 | 52261.2 | 9113 | 28208 |
| 7/19/09 | 52261.2 | 9113 | 28208 |
| 7/20/09 | 52261.2 | 9113 | 28208 |
| 7/21/09 | 52261.2 | 9113 | 28208 |
| 7/22/09 | 52261.2 | 9113 | 28208 |
| 7/23/09 | 50894.2 | 9113 | 27731 |
| 7/24/09 | 50894.2 | 9113 | 27731 |
| 7/25/09 | 50894.2 | 9113 | 27731 |
| 7/26/09 | 50894.2 | 9113 | 27731 |
| 7/27/09 | 50894.2 | 9113 | 27731 |
| 7/28/09 | 50894.2 | 9113 | 27731 |
| 7/29/09 | 50894.2 | 9113 | 27731 |
| 7/30/09 | 48252.2 | 8113 | 27731 |
| 7/31/09 | 48252.2 | 8113 | 19906 |
| 8/1/09 | 48252.2 | 8113 | 19906 |
| 8/2/09 | 48252.2 | 8113 | 19906 |
| 8/3/09 | 48252.2 | 8113 | 19906 |
| 8/4/09 | 48252.2 | 8113 | 19906 |
| 8/5/09 | 48252.2 | 8113 | 19906 |
| 8/6/09 | 48692.3 | 8113 | 19906 |
| 8/7/09 | 48692.3 | 8113 | 19906 |
| 8/8/09 | 48692.3 | 8113 | 19906 |
| 8/9/09 | 48692.3 | 8113 | 19906 |
| 8/10/09 | 48692.3 | 8113 | 19906 |
| 8/11/09 | 48692.3 | 8113 | 18406 |
| 8/12/09 | 48692.3 | 8113 | 18406 |
| 8/13/09 | 49424.3 | 2611 | 17106 |
| 8/14/09 | 49424.3 | 2611 | 17106 |
| 8/15/09 | 49424.3 | 2611 | 17106 |
| 8/16/09 | 49424.3 | 2611 | 17106 |
| 8/17/09 | 49424.3 | 2611 | 17106 |
| 8/18/09 | 49424.3 | 2611 | 17106 |
| 8/19/09 | 49424.3 | 2611 | 17106 |
| 8/20/09 | 42536 | 2611 | 15063 |
| 8/21/09 | 42536 | 2611 | 15063 |
| 8/22/09 | 42536 | 2611 | 15063 |
| 8/23/09 | 42536 | 2611 | 15063 |
| 8/24/09 | 42536 | 2611 | 15063 |
| 8/25/09 | 42536 | 2611 | 15063 |
| 8/26/09 | 42536 | 2611 | 15063 |
| 8/27/09 | 46112 | 2121 | 15054 |
| 8/28/09 | 46112 | 2121 | 15054 |
| 8/29/09 | 46112 | 2121 | 15054 |
| 8/30/09 | 46112 | 2121 | 15054 |
| 8/31/09 | 46112 | 2121 | 15054 |
| 9/1/09 | 46112 | 2121 | 15054 |
| 9/2/09 | 46112 | 2121 | 15054 |
| 9/3/09 | 45632 | 2121 | 13854 |
| 9/4/09 | 45632 | 2121 | 13854 |
| 9/5/09 | 45632 | 2121 | 13854 |
| 9/6/09 | 45632 | 2121 | 13854 |
| 9/7/09 | 45632 | 2121 | 13854 |
| 9/8/09 | 45632 | 2121 | 13854 |
| 9/9/09 | 45632 | 2121 | 13854 |
| 9/10/09 | 45217 | 2040 | 13844 |
| 9/11/09 | 45217 | 2040 | 13844 |
| 9/12/09 | 45217 | 2040 | 13844 |
| 9/13/09 | 45217 | 2040 | 13844 |
| 9/14/09 | 45217 | 2040 | 13844 |
| 9/15/09 | 45217 | 2040 | 13844 |
| 9/16/09 | 45217 | 2040 | 13844 |
| 9/17/09 | 44967.3 | 2040 | 12114 |
| 9/18/09 | 44967.3 | 2040 | 12114 |
| 9/19/09 | 44967.3 | 2040 | 12114 |
| 9/20/09 | 44967.3 | 2040 | 12114 |
| 9/21/09 | 44967.3 | 2040 | 12114 |
| 9/22/09 | 44967.3 | 2040 | 12114 |
| 9/23/09 | 44967.3 | 2040 | 12114 |
| 9/24/09 | 43662.3 | 1530 | 11564 |
| 9/25/09 | 43662.3 | 1530 | 11564 |
| 9/26/09 | 43662.3 | 1530 | 11564 |
| 9/27/09 | 43662.3 | 1530 | 11564 |
| 9/28/09 | 43662.3 | 1530 | 11564 |
| 9/29/09 | 43662.3 | 1530 | 11564 |
| 9/30/09 | 43662.3 | 1530 | 11564 |
| 10/1/09 | 37736.8 | 1530 | 10564 |
| 10/2/09 | 37736.8 | 1530 | 10564 |
| 10/3/09 | 37736.8 | 1530 | 10564 |
| 10/4/09 | 37736.8 | 1530 | 10564 |
| 10/5/09 | 37736.8 | 1530 | 10564 |
| 10/6/09 | 37736.8 | 1530 | 10564 |
| 10/7/09 | 37736.8 | 1530 | 10564 |
| 10/8/09 | 32617.8 | 1445 | 9564 |
| 10/9/09 | 32617.8 | 1445 | 9564 |
| 10/10/09 | 32617.8 | 1445 | 9564 |
| 10/11/09 | 32617.8 | 1445 | 9564 |
| 10/12/09 | 32617.8 | 1445 | 9564 |
| 10/13/09 | 32617.8 | 1445 | 9564 |
| 10/14/09 | 32617.8 | 1445 | 9564 |
| 10/15/09 | 31207.6 | 1445 | 8984 |
| 10/16/09 | 31207.6 | 1445 | 8984 |
| 10/17/09 | 31207.6 | 1445 | 8984 |
| 10/18/09 | 31207.6 | 1445 | 8984 |
| 10/19/09 | 31207.6 | 1445 | 8984 |
| 10/20/09 | 31207.6 | 1445 | 8984 |
| 10/21/09 | 31207.6 | 1445 | 8984 |
| 10/22/09 | 25710.5 | 935 | 8984 |
| 10/23/09 | 25710.5 | 935 | 6284 |
| 10/24/09 | 25710.5 | 935 | 6284 |
| 10/25/09 | 25710.5 | 935 | 6284 |
| 10/26/09 | 25710.5 | 935 | 6284 |
| 10/27/09 | 25710.5 | 935 | 6284 |
| 10/28/09 | 25710.5 | 935 | 6284 |
| 10/29/09 | 24665.4 | 935 | 6284 |
| 10/30/09 | 24665.4 | 935 | 6284 |
| 10/31/09 | 24665.4 | 935 | 6284 |
| 11/1/09 | 24665.4 | 935 | 6284 |
| 11/2/09 | 24665.4 | 935 | 6284 |
| 11/3/09 | 24665.4 | 935 | 6284 |
| 11/4/09 | 24665.4 | 935 | 6284 |
| 11/5/09 | 23189 | 815 | 5084 |
| 11/6/09 | 23189 | 815 | 5084 |
| 11/7/09 | 23189 | 815 | 5084 |
| 11/8/09 | 23189 | 815 | 5084 |
| 11/9/09 | 23189 | 815 | 5084 |
| 11/10/09 | 23189 | 815 | 5084 |
| 11/11/09 | 23189 | 815 | 5084 |
| 11/12/09 | 22979 | 815 | 4484 |
| 11/13/09 | 22979 | 815 | 4484 |
| 11/14/09 | 22979 | 815 | 4484 |
| 11/15/09 | 22979 | 815 | 4484 |
| 11/16/09 | 22979 | 815 | 4484 |
| 11/17/09 | 22979 | 815 | 4484 |
| 11/18/09 | 22979 | 815 | 4484 |
| 11/19/09 | 20912 | 415 | 4484 |
| 11/20/09 | 20912 | 415 | 4484 |
| 11/21/09 | 20912 | 415 | 4484 |
| 11/22/09 | 20912 | 415 | 4484 |
| 11/23/09 | 20912 | 415 | 4484 |
| 11/24/09 | 20912 | 415 | 4484 |
| 11/25/09 | 20912 | 415 | 4484 |
| 11/26/09 | 20912 | 415 | 4484 |
| 11/27/09 | 18939 | 415 | 3684 |
| 11/28/09 | 18939 | 415 | 3684 |
| 11/29/09 | 18939 | 415 | 3684 |
| 11/30/09 | 18939 | 415 | 3684 |
| 12/1/09 | 18939 | 415 | 3684 |
| 12/2/09 | 18939 | 415 | 3684 |
| 12/3/09 | 12589 | 245 | 3684 |
| 12/4/09 | 12589 | 245 | 3671 |
| 12/5/09 | 12589 | 245 | 3671 |
| 12/6/09 | 12589 | 245 | 3671 |
| 12/7/09 | 12589 | 245 | 3671 |
| 12/8/09 | 12589 | 245 | 3671 |
| 12/9/09 | 12589 | 245 | 3671 |
| 12/10/09 | 10576 | 245 | 3671 |
| 12/11/09 | 10576 | 245 | 3671 |
| 12/12/09 | 10576 | 245 | 3671 |
| 12/13/09 | 10576 | 245 | 3671 |
| 12/14/09 | 10576 | 245 | 3671 |
| 12/15/09 | 10576 | 245 | 3671 |
| 12/16/09 | 10576 | 245 | 3671 |
| 12/17/09 | 8606 | 545 | 3221 |
| 12/18/09 | 8606 | 545 | 3221 |
| 12/19/09 | 8606 | 545 | 3221 |
| 12/20/09 | 8606 | 545 | 3221 |
| 12/21/09 | 8606 | 545 | 3221 |
| 12/22/09 | 8606 | 545 | 3221 |
| 12/23/09 | 6506 | 545 | 3221 |
| 12/24/09 | 6506 | 545 | 3221 |
| 12/25/09 | 6506 | 545 | 3221 |
| 12/26/09 | 6506 | 545 | 3221 |
| 12/27/09 | 6506 | 545 | 3221 |
| 12/28/09 | 6506 | 545 | 3221 |
| 12/29/09 | 6506 | 545 | 3221 |
| 12/30/09 | 6506 | 545 | 3221 |
| 12/31/09 | 6506 | 545 | 3221 |
| 1/1/10 | 6506 | 545 | 3221 |
| 1/2/10 | 6506 | 545 | 3221 |
| 1/3/10 | 6506 | 545 | 3221 |
| 1/4/10 | 6506 | 545 | 3221 |
| 1/5/10 | 6506 | 545 | 3221 |
| 1/6/10 | 6506 | 545 | 3221 |
| 1/7/10 | 5350 | 545 | 3221 |
| 1/8/10 | 5350 | 545 | 3221 |
| 1/9/10 | 5350 | 545 | 3221 |
| 1/10/10 | 5350 | 545 | 3221 |
| 1/11/10 | 5350 | 545 | 3221 |
| 1/12/10 | 5350 | 545 | 0 |
| 1/13/10 | 5350 | 545 | 0 |
| 1/14/10 | 1150 | 100 | 0 |
| 1/15/10 | 1150 | 100 | 0 |
| 1/16/10 | 1150 | 100 | 0 |
| 1/17/10 | 1150 | 100 | 0 |
| 1/18/10 | 1150 | 100 | 0 |
| 1/19/10 | 1150 | 100 | 0 |
| 1/20/10 | 1150 | 100 | 0 |
| 1/21/10 | 75 | 100 | 0 |
| 1/22/10 | 75 | 100 | 0 |
| 1/23/10 | 75 | 100 | 0 |
| 1/24/10 | 75 | 100 | 0 |
| 1/25/10 | 75 | 100 | 0 |
| 1/26/10 | 75 | 100 | 0 |
| 1/27/10 | 75 | 100 | 0 |
| 1/28/10 | 0 | 100 | 0 |
| 1/29/10 | 0 | 100 | 0 |
| 1/30/10 | 0 | 100 | 0 |
| 1/31/10 | 0 | 100 | 0 |
| 2/1/10 | 0 | 100 | 0 |
| 2/2/10 | 0 | 100 | 0 |
| 2/3/10 | 0 | 100 | 0 |
| 2/4/10 | 0 | 100 | 0 |
| 2/5/10 | 0 | 100 | 0 |
| 2/6/10 | 0 | 100 | 0 |
| 2/7/10 | 0 | 100 | 0 |
| 2/8/10 | 0 | 100 | 0 |
| 2/9/10 | 0 | 100 | 0 |
| 2/10/10 | 0 | 100 | 0 |
| 2/11/10 | 0 | 100 | 0 |
| 2/12/10 | 0 | 0 | 0 |
| 2/13/10 | 0 | 0 | 0 |
| 2/14/10 | 0 | 0 | 0 |
| 2/15/10 | 0 | 0 | 0 |
| 2/16/10 | 0 | 0 | 0 |
| 2/17/10 | 0 | 0 | 0 |
| 2/18/10 | 0 | 0 | 0 |
| 2/19/10 | 0 | 0 | 0 |
| 2/20/10 | 0 | 0 | 0 |
| 2/21/10 | 0 | 0 | 0 |
| 2/22/10 | 0 | 0 | 0 |
| 2/23/10 | 0 | 0 | 0 |
| 2/24/10 | 0 | 0 | 0 |
| 2/25/10 | 0 | 0 | 0 |
| 2/26/10 | 0 | 0 | 0 |
| 2/27/10 | 0 | 0 | 0 |
| 2/28/10 | 0 | 0 | 0 |
| 3/1/10 | 0 | 0 | 0 |
| 3/2/10 | 0 | 0 | 0 |
| 3/3/10 | 0 | 0 | 0 |
| 3/4/10 | 0 | 0 | 0 |
| 3/5/10 | 0 | 0 | 0 |
| 3/6/10 | 0 | 0 | 0 |
| 3/7/10 | 0 | 0 | 0 |
| 3/8/10 | 0 | 0 | 0 |
| 3/9/10 | 0 | 0 | 0 |
| 3/10/10 | 0 | 0 | 0 |
| 3/11/10 | 0 | 0 | 0 |
| 3/12/10 | 0 | 0 | 0 |
| 3/13/10 | 0 | 0 | 0 |
| 3/14/10 | 0 | 0 | 0 |
| 3/15/10 | 0 | 0 | 0 |
| 3/16/10 | 0 | 0 | 0 |
| 3/17/10 | 0 | 0 | 0 |
| 3/18/10 | 0 | 0 | 0 |
| 3/19/10 | 0 | 0 | 0 |
| 3/20/10 | 0 | 0 | 0 |
| 3/21/10 | 0 | 0 | 0 |
| 3/22/10 | 0 | 0 | 0 |
| 3/23/10 | 0 | 0 | 0 |
| 3/24/10 | 0 | 0 | 0 |
| 3/25/10 | 0 | 0 | 0 |
| 3/26/10 | 0 | 0 | 0 |
| 3/27/10 | 0 | 0 | 0 |
| 3/28/10 | 0 | 0 | 0 |
| 3/29/10 | 0 | 0 | 0 |
| 3/30/10 | 0 | 0 | 0 |
| 3/31/10 | 0 | 0 | 0 |
| 4/1/10 | 0 | 0 | 0 |
| 4/2/10 | 0 | 0 | 0 |
| 4/3/10 | 0 | 0 | 0 |
| 4/4/10 | 0 | 0 | 0 |
| 4/5/10 | 0 | 0 | 0 |
| 4/6/10 | 0 | 0 | 0 |
| 4/7/10 | 0 | 0 | 0 |
| 4/8/10 | 0 | 0 | 0 |
| 4/9/10 | 0 | 0 | 0 |
| 4/10/10 | 0 | 0 | 0 |
| 4/11/10 | 0 | 0 | 0 |
| 4/12/10 | 0 | 0 | 0 |
| 4/13/10 | 0 | 0 | 0 |
| 4/14/10 | 0 | 0 | 0 |
| 4/15/10 | 0 | 0 | 0 |
| 4/16/10 | 0 | 0 | 0 |
| 4/17/10 | 0 | 0 | 0 |
| 4/18/10 | 0 | 0 | 0 |
| 4/19/10 | 0 | 0 | 0 |
| 4/20/10 | 0 | 0 | 0 |
| 4/21/10 | 0 | 0 | 0 |
| 4/22/10 | 0 | 0 | 0 |
| 4/23/10 | 0 | 0 | 0 |
| 4/24/10 | 0 | 0 | 0 |
| 4/25/10 | 0 | 0 | 0 |
| 4/26/10 | 0 | 0 | 0 |
| 4/27/10 | 0 | 0 | 0 |
| 4/28/10 | 0 | 0 | 0 |
| 4/29/10 | 0 | 0 | 0 |
| 4/30/10 | 0 | 0 | 0 |
| 5/1/10 | 0 | 0 | 0 |
| 5/2/10 | 0 | 0 | 0 |
| 5/3/10 | 0 | 0 | 0 |
| 5/4/10 | 0 | 0 | 0 |
| 5/5/10 | 0 | 0 | 0 |
| 5/6/10 | 0 | 0 | 0 |
| 5/7/10 | 0 | 0 | 0 |
| 5/8/10 | 0 | 0 | 0 |
| 5/9/10 | 0 | 0 | 0 |
| 5/10/10 | 0 | 0 | 0 |
| 5/11/10 | 0 | 0 | 0 |
| 5/12/10 | 9205 | 0 | 0 |
| 5/13/10 | 9205 | 0 | 0 |
| 5/14/10 | 9205 | 0 | 0 |
| 5/15/10 | 9205 | 0 | 0 |
| 5/16/10 | 9205 | 0 | 0 |
| 5/17/10 | 9205 | 0 | 0 |
| 5/18/10 | 9205 | 0 | 0 |
| 5/19/10 | 9205 | 0 | 0 |
| 5/20/10 | 1032 | 210 | 0 |
| 5/21/10 | 1032 | 210 | 0 |
| 5/22/10 | 1032 | 210 | 0 |
| 5/23/10 | 1032 | 210 | 0 |
| 5/24/10 | 1032 | 210 | 0 |
| 5/25/10 | 1032 | 210 | 0 |
| 5/26/10 | 1032 | 210 | 0 |
| 5/27/10 | 6432 | 210 | 0 |
| 5/28/10 | 6432 | 210 | 0 |
| 5/29/10 | 6432 | 210 | 0 |
| 5/30/10 | 6432 | 210 | 0 |
| 5/31/10 | 6432 | 210 | 0 |
| 6/1/10 | 6432 | 210 | 0 |
| 6/2/10 | 6432 | 210 | 0 |
| 6/3/10 | 1032 | 210 | 0 |
| 6/4/10 | 1032 | 210 | 0 |
| 6/5/10 | 1032 | 210 | 0 |
| 6/6/10 | 1032 | 210 | 0 |
| 6/7/10 | 1032 | 210 | 0 |
| 6/8/10 | 1032 | 210 | 0 |
| 6/9/10 | 1032 | 210 | 0 |
| 6/10/10 | 1032 | 210 | 0 |
| 6/11/10 | 1032 | 210 | 0 |
| 6/12/10 | 1032 | 210 | 0 |
| 6/13/10 | 1032 | 210 | 0 |
| 6/14/10 | 1032 | 210 | 0 |
| 6/15/10 | 1032 | 210 | 0 |
| 6/16/10 | 1032 | 210 | 0 |
| 6/17/10 | 1032 | 213 | 0 |
| 6/18/10 | 1032 | 213 | 0 |
| 6/19/10 | 1032 | 213 | 0 |
| 6/20/10 | 1032 | 213 | 0 |
| 6/21/10 | 1032 | 213 | 0 |
| 6/22/10 | 1032 | 213 | 0 |
| 6/23/10 | 1032 | 213 | 0 |
| 6/24/10 | 1032 | 213 | 0 |
| 6/25/10 | 1032 | 213 | 0 |
| 6/26/10 | 1032 | 213 | 0 |
| 6/27/10 | 1032 | 213 | 0 |
| 6/28/10 | 1032 | 213 | 0 |
| 6/29/10 | 1032 | 213 | 0 |
| 6/30/10 | 1032 | 213 | 0 |
| 7/1/10 | 1032 | 213 | 0 |
| 7/2/10 | 1032 | 213 | 0 |
| 7/3/10 | 1032 | 213 | 0 |
| 7/4/10 | 1032 | 213 | 0 |
| 7/5/10 | 1032 | 213 | 0 |
| 7/6/10 | 1032 | 213 | 0 |
| 7/7/10 | 1032 | 213 | 0 |
| 7/8/10 | 1032 | 213 | 0 |
| 7/9/10 | 1032 | 213 | 0 |
| 7/10/10 | 1032 | 213 | 0 |
| 7/11/10 | 1032 | 213 | 0 |
| 7/12/10 | 1032 | 213 | 0 |
| 7/13/10 | 1032 | 213 | 0 |
| 7/14/10 | 1032 | 213 | 0 |
| 7/15/10 | 1032 | 214 | 0 |
| 7/16/10 | 1032 | 214 | 0 |
| 7/17/10 | 1032 | 214 | 0 |
| 7/18/10 | 1032 | 214 | 0 |
| 7/19/10 | 1032 | 214 | 0 |
| 7/20/10 | 1032 | 214 | 0 |
| 7/21/10 | 1032 | 214 | 0 |
| 7/22/10 | 1032 | 214 | 0 |
| 7/23/10 | 1032 | 214 | 0 |
| 7/24/10 | 1032 | 214 | 0 |
| 7/25/10 | 1032 | 214 | 0 |
| 7/26/10 | 1032 | 214 | 0 |
| 7/27/10 | 1032 | 214 | 0 |
| 7/28/10 | 1032 | 214 | 0 |
| 7/29/10 | 1032 | 214 | 0 |
| 7/30/10 | 1032 | 214 | 0 |
| 7/31/10 | 1032 | 214 | 0 |
| 8/1/10 | 1032 | 214 | 0 |
| 8/2/10 | 1032 | 214 | 0 |
| 8/3/10 | 1032 | 214 | 0 |
| 8/4/10 | 1032 | 214 | 0 |
| 8/5/10 | 1032 | 214 | 0 |
| 8/6/10 | 1032 | 214 | 0 |
| 8/7/10 | 1032 | 214 | 0 |
| 8/8/10 | 1032 | 214 | 0 |
| 8/9/10 | 1032 | 214 | 0 |
| 8/10/10 | 1032 | 214 | 0 |
| 8/11/10 | 1032 | 214 | 0 |
| 8/12/10 | 0 | 4 | 0 |
| 8/13/10 | 0 | 4 | 0 |
| 8/14/10 | 0 | 4 | 0 |
| 8/15/10 | 0 | 4 | 0 |
| 8/16/10 | 0 | 4 | 0 |
| 8/17/10 | 0 | 4 | 0 |
| 8/18/10 | 0 | 4 | 0 |
| 8/19/10 | 0 | 4 | 0 |
| 8/20/10 | 0 | 4 | 0 |
| 8/21/10 | 0 | 4 | 0 |
| 8/22/10 | 0 | 4 | 0 |
| 8/23/10 | 0 | 4 | 0 |
| 8/24/10 | 0 | 4 | 0 |
| 8/25/10 | 0 | 4 | 0 |
| 8/26/10 | 0 | 4 | 0 |
| 8/27/10 | 0 | 4 | 0 |
| 8/28/10 | 0 | 4 | 0 |
| 8/29/10 | 0 | 4 | 0 |
| 8/30/10 | 0 | 4 | 0 |
| 8/31/10 | 0 | 4 | 0 |
| 9/1/10 | 0 | 4 | 0 |
| 9/2/10 | 0 | 4 | 0 |
| 9/3/10 | 0 | 4 | 0 |
| 9/4/10 | 0 | 4 | 0 |
| 9/5/10 | 0 | 4 | 0 |
| 9/6/10 | 0 | 4 | 0 |
| 9/7/10 | 0 | 4 | 0 |
| 9/8/10 | 0 | 4 | 0 |
| 9/9/10 | 0 | 1 | 0 |
| 9/10/10 | 0 | 1 | 0 |
| 9/11/10 | 0 | 1 | 0 |
| 9/12/10 | 0 | 1 | 0 |
| 9/13/10 | 0 | 1 | 0 |
| 9/14/10 | 0 | 1 | 0 |
| 9/15/10 | 0 | 1 | 0 |
| 9/16/10 | 0 | 1 | 0 |
| 9/17/10 | 0 | 1 | 0 |
| 9/18/10 | 0 | 1 | 0 |
| 9/19/10 | 0 | 1 | 0 |
| 9/20/10 | 0 | 1 | 0 |
| 9/21/10 | 0 | 1 | 0 |
| 9/22/10 | 0 | 1 | 0 |
| 9/23/10 | 0 | 1 | 0 |
| 9/24/10 | 0 | 1 | 0 |
| 9/25/10 | 0 | 1 | 0 |
| 9/26/10 | 0 | 1 | 0 |
| 9/27/10 | 0 | 1 | 0 |
| 9/28/10 | 0 | 1 | 0 |
| 9/29/10 | 0 | 1 | 0 |
| 9/30/10 | 0 | 1 | 0 |
| 10/1/10 | 0 | 1 | 0 |
| 10/2/10 | 0 | 1 | 0 |
| 10/3/10 | 0 | 1 | 0 |
| 10/4/10 | 0 | 1 | 0 |
| 10/5/10 | 0 | 1 | 0 |
| 10/6/10 | 0 | 1 | 0 |
| 10/7/10 | 0 | 0 | 0 |
| 10/8/10 | 0 | 0 | 0 |
| 10/9/10 | 0 | 0 | 0 |
| 10/10/10 | 0 | 0 | 0 |
| 10/11/10 | 0 | 0 | 0 |
| 10/12/10 | 0 | 0 | 0 |
| 10/13/10 | 0 | 0 | 0 |
| 10/14/10 | 0 | 0 | 0 |
| 10/15/10 | 0 | 0 | 0 |
| 10/16/10 | 0 | 0 | 0 |
| 10/17/10 | 0 | 0 | 0 |
| 10/18/10 | 0 | 0 | 0 |
| 10/19/10 | 0 | 0 | 0 |
| 10/20/10 | 0 | 0 | 0 |
| 10/21/10 | 0 | 0 | 0 |
| 10/22/10 | 0 | 0 | 0 |
| 10/23/10 | 0 | 0 | 0 |
| 10/24/10 | 0 | 0 | 0 |
| 10/25/10 | 0 | 0 | 0 |
| 10/26/10 | 0 | 0 | 0 |
| 10/27/10 | 0 | 0 | 0 |
| 10/28/10 | 0 | 0 | 0 |
| 10/29/10 | 0 | 0 | 0 |
| 10/30/10 | 0 | 0 | 0 |
| 10/31/10 | 0 | 0 | 0 |
| 11/1/10 | 0 | 0 | 0 |
| 11/2/10 | 0 | 0 | 0 |
| 11/3/10 | 0 | 0 | 0 |
| 11/4/10 | 0 | 0 | 0 |
| 11/5/10 | 0 | 0 | 0 |
| 11/6/10 | 0 | 0 | 0 |
| 11/7/10 | 0 | 0 | 0 |
| 11/8/10 | 0 | 0 | 0 |
| 11/9/10 | 0 | 0 | 0 |
| 11/10/10 | 0 | 0 | 0 |
| 11/11/10 | 0 | 0 | 0 |
| 11/12/10 | 0 | 0 | 0 |
| 11/13/10 | 0 | 0 | 0 |
| 11/14/10 | 0 | 0 | 0 |
| 11/15/10 | 0 | 0 | 0 |
| 11/16/10 | 0 | 0 | 0 |
| 11/17/10 | 0 | 0 | 0 |
| 11/18/10 | 0 | 0 | 0 |
| 11/19/10 | 0 | 0 | 0 |
| 11/20/10 | 0 | 0 | 0 |
| 11/21/10 | 0 | 0 | 0 |
| 11/22/10 | 0 | 0 | 0 |
| 11/23/10 | 0 | 0 | 0 |
| 11/24/10 | 0 | 0 | 0 |
| 11/25/10 | 0 | 0 | 0 |
| 11/26/10 | 0 | 0 | 0 |
| 11/27/10 | 0 | 0 | 0 |
| 11/28/10 | 0 | 0 | 0 |
| 11/29/10 | 0 | 0 | 0 |
| 11/30/10 | 0 | 0 | 0 |
| 12/1/10 | 0 | 0 | 0 |
| 12/2/10 | 0 | 0 | 0 |
| 12/3/10 | 0 | 0 | 0 |
| 12/4/10 | 0 | 0 | 0 |
| 12/5/10 | 0 | 0 | 0 |
| 12/6/10 | 0 | 0 | 0 |
| 12/7/10 | 0 | 0 | 0 |
| 12/8/10 | 0 | 0 | 0 |
| 12/9/10 | 0 | 0 | 0 |
| 12/10/10 | 0 | 0 | 0 |
| 12/11/10 | 0 | 0 | 0 |
| 12/12/10 | 0 | 0 | 0 |
| 12/13/10 | 0 | 0 | 0 |
| 12/14/10 | 0 | 0 | 0 |
| 12/15/10 | 0 | 0 | 0 |
| 12/16/10 | 0 | 0 | 0 |
| 12/17/10 | 0 | 0 | 0 |
| 12/18/10 | 0 | 0 | 0 |
| 12/19/10 | 0 | 0 | 0 |
| 12/20/10 | 0 | 0 | 0 |
| 12/21/10 | 0 | 0 | 0 |
| 12/22/10 | 0 | 0 | 0 |
| 12/23/10 | 0 | 0 | 0 |
| 12/24/10 | 0 | 0 | 0 |
| 12/25/10 | 0 | 0 | 0 |
| 12/26/10 | 0 | 0 | 0 |
| 12/27/10 | 0 | 0 | 0 |
| 12/28/10 | 0 | 0 | 0 |
| 12/29/10 | 0 | 0 | 0 |
| 12/30/10 | 0 | 0 | 0 |
| 12/31/10 | 0 | 0 | 0 |